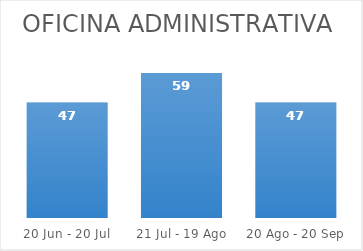
| Category | Series 0 |
|---|---|
| 20 Jun - 20 Jul | 47 |
| 21 Jul - 19 Ago | 59 |
| 20 Ago - 20 Sep | 47 |